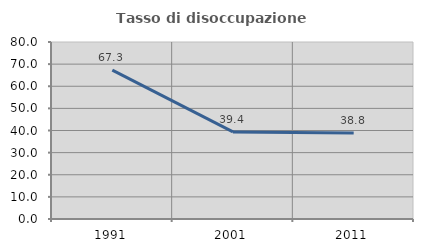
| Category | Tasso di disoccupazione giovanile  |
|---|---|
| 1991.0 | 67.277 |
| 2001.0 | 39.367 |
| 2011.0 | 38.839 |